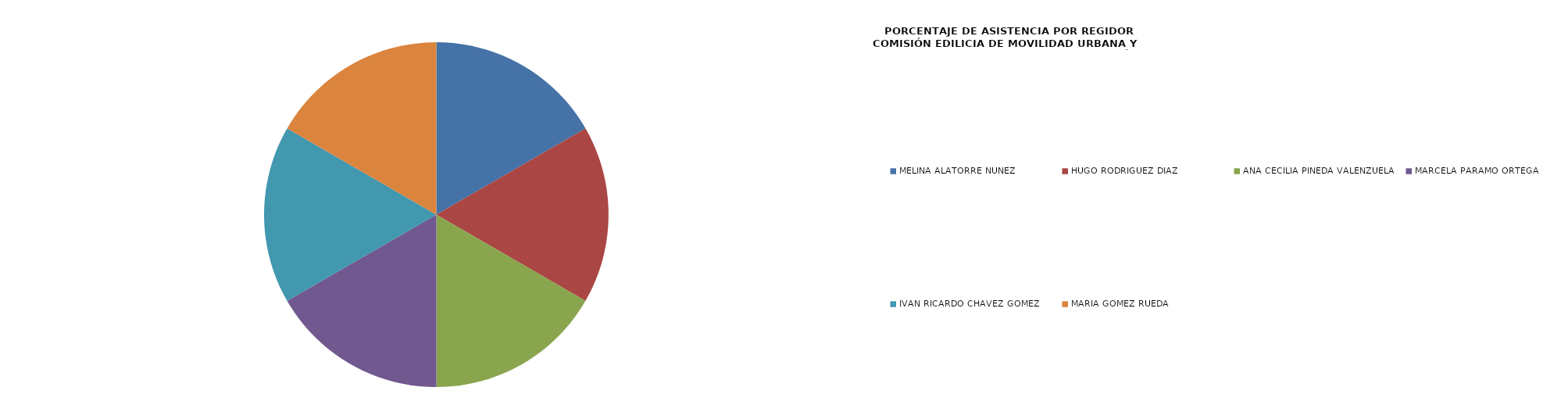
| Category | Series 0 |
|---|---|
| MELINA ALATORRE NÚÑEZ | 100 |
| HUGO RODRÍGUEZ DÍAZ | 100 |
| ANA CECILIA PINEDA VALENZUELA | 100 |
| MARCELA PARÁMO ORTEGA | 100 |
| IVÁN RICARDO CHÁVEZ GÓMEZ | 100 |
| MARÍA GÓMEZ RUEDA | 100 |